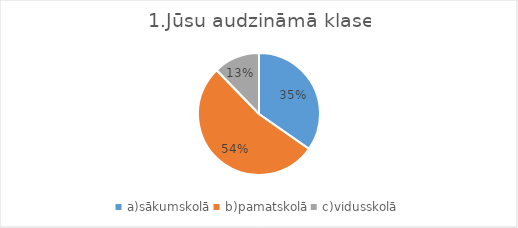
| Category | Series 0 |
|---|---|
| a)sākumskolā | 0.354 |
| b)pamatskolā | 0.542 |
| c)vidusskolā | 0.125 |